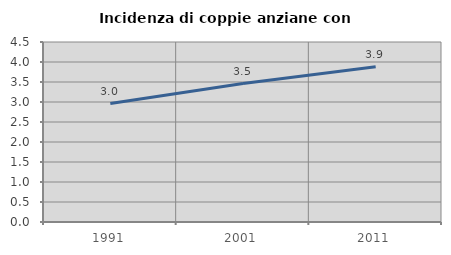
| Category | Incidenza di coppie anziane con figli |
|---|---|
| 1991.0 | 2.962 |
| 2001.0 | 3.462 |
| 2011.0 | 3.879 |